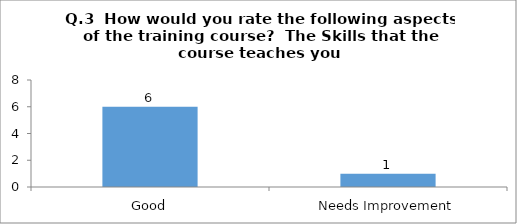
| Category | Q.3  How would you rate the following aspects of the training course?  The Skills that the course teaches you |
|---|---|
| Good | 6 |
| Needs Improvement | 1 |